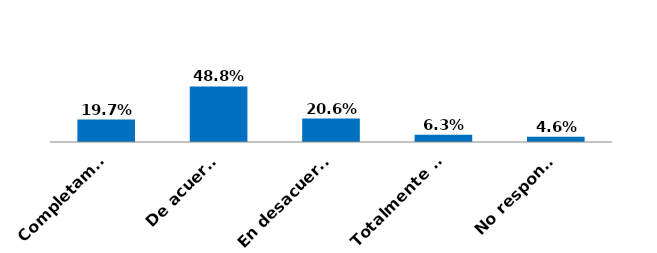
| Category | Series 0 |
|---|---|
| Completamente de acuerdo | 0.197 |
| De acuerdo | 0.488 |
| En desacuerdo | 0.206 |
| Totalmente en desacuerdo | 0.063 |
| No responde | 0.046 |